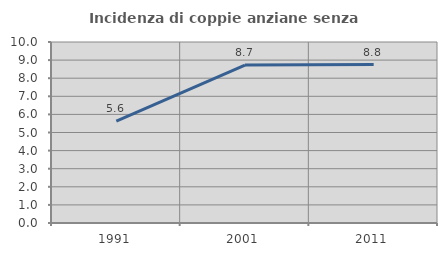
| Category | Incidenza di coppie anziane senza figli  |
|---|---|
| 1991.0 | 5.628 |
| 2001.0 | 8.727 |
| 2011.0 | 8.754 |